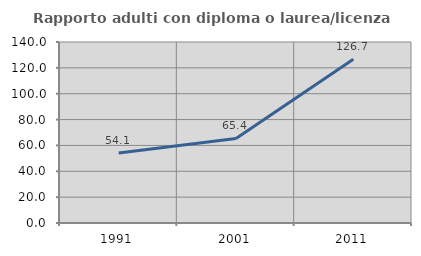
| Category | Rapporto adulti con diploma o laurea/licenza media  |
|---|---|
| 1991.0 | 54.104 |
| 2001.0 | 65.432 |
| 2011.0 | 126.73 |